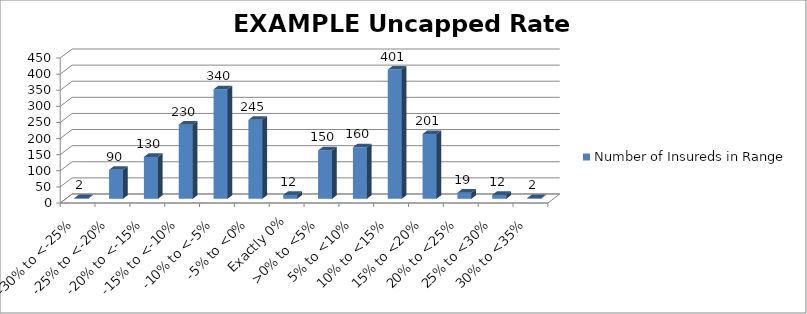
| Category | Number of Insureds in Range |
|---|---|
| -30% to <-25% | 2 |
| -25% to <-20% | 90 |
| -20% to <-15% | 130 |
| -15% to <-10% | 230 |
| -10% to <-5% | 340 |
| -5% to <0% | 245 |
| Exactly 0% | 12 |
| >0% to <5% | 150 |
| 5% to <10% | 160 |
| 10% to <15% | 401 |
| 15% to <20% | 201 |
| 20% to <25% | 19 |
| 25% to <30% | 12 |
| 30% to <35% | 2 |